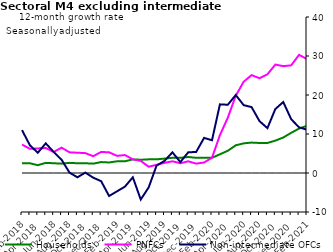
| Category | zero | Households | PNFCs | Non-intermediate OFCs |
|---|---|---|---|---|
| Feb-2018 | 0 | 2.5 | 7.3 | 11 |
| Mar-2018 | 0 | 2.5 | 6.2 | 7.1 |
| Apr-2018 | 0 | 2 | 6.3 | 5.2 |
| May-2018 | 0 | 2.6 | 6.4 | 7.6 |
| Jun-2018 | 0 | 2.5 | 5.4 | 5.4 |
| Jul-2018 | 0 | 2.4 | 6.5 | 3.4 |
| Aug-2018 | 0 | 2.6 | 5.3 | 0.1 |
| Sep-2018 | 0 | 2.5 | 5.2 | -1.1 |
| Oct-2018 | 0 | 2.5 | 5.1 | 0.1 |
| Nov-2018 | 0 | 2.4 | 4.3 | -1.2 |
| Dec-2018 | 0 | 2.8 | 5.4 | -2.1 |
| Jan-2019 | 0 | 2.7 | 5.3 | -5.9 |
| Feb-2019 | 0 | 3 | 4.4 | -4.7 |
| Mar-2019 | 0 | 3 | 4.6 | -3.5 |
| Apr-2019 | 0 | 3.5 | 3.5 | -1.1 |
| May-2019 | 0 | 3.4 | 3.1 | -6.8 |
| Jun-2019 | 0 | 3.5 | 1.6 | -3.7 |
| Jul-2019 | 0 | 3.5 | 2.1 | 1.9 |
| Aug-2019 | 0 | 3.7 | 2.6 | 3.1 |
| Sep-2019 | 0 | 3.9 | 3 | 5.3 |
| Oct-2019 | 0 | 3.9 | 2.5 | 2.8 |
| Nov-2019 | 0 | 4.1 | 3 | 5.3 |
| Dec-2019 | 0 | 3.9 | 2.4 | 5.4 |
| Jan-2020 | 0 | 3.9 | 2.7 | 9 |
| Feb-2020 | 0 | 3.9 | 3.9 | 8.4 |
| Mar-2020 | 0 | 4.8 | 9.7 | 17.6 |
| Apr-2020 | 0 | 5.7 | 14.2 | 17.5 |
| May-2020 | 0 | 7.1 | 19.8 | 20 |
| Jun-2020 | 0 | 7.6 | 23.4 | 17.4 |
| Jul-2020 | 0 | 7.8 | 25.1 | 16.9 |
| Aug-2020 | 0 | 7.7 | 24.3 | 13.3 |
| Sep-2020 | 0 | 7.7 | 25.3 | 11.5 |
| Oct-2020 | 0 | 8.3 | 27.8 | 16.4 |
| Nov-2020 | 0 | 9.1 | 27.4 | 18.2 |
| Dec-2020 | 0 | 10.3 | 27.6 | 13.8 |
| Jan-2021 | 0 | 11.4 | 30.3 | 11.7 |
| Feb-2021 | 0 | 12.1 | 29.2 | 11.1 |